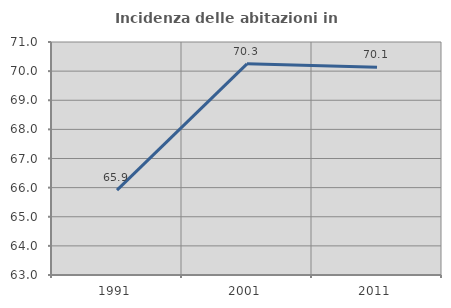
| Category | Incidenza delle abitazioni in proprietà  |
|---|---|
| 1991.0 | 65.913 |
| 2001.0 | 70.25 |
| 2011.0 | 70.132 |